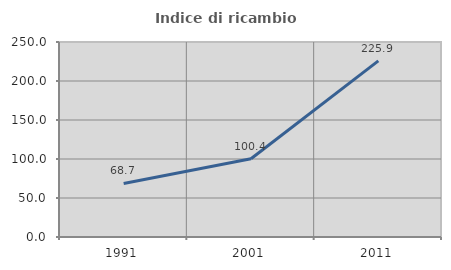
| Category | Indice di ricambio occupazionale  |
|---|---|
| 1991.0 | 68.651 |
| 2001.0 | 100.373 |
| 2011.0 | 225.871 |